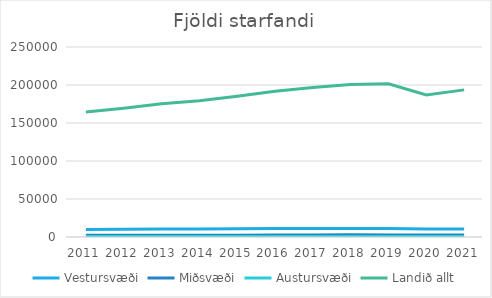
| Category | Vestursvæði | Miðsvæði | Austursvæði | Landið allt |
|---|---|---|---|---|
| 2011.0 | 9753.667 | 2243.667 | 595.667 | 164445.583 |
| 2012.0 | 10152.167 | 2228 | 608.417 | 169434.083 |
| 2013.0 | 10500.25 | 2268.333 | 621.167 | 175288.75 |
| 2014.0 | 10517.25 | 2283.583 | 605.333 | 179222.833 |
| 2015.0 | 10781.167 | 2363.417 | 614.25 | 185336.667 |
| 2016.0 | 11111.167 | 2482 | 604 | 191828.333 |
| 2017.0 | 11344.75 | 2711.25 | 604.583 | 196592 |
| 2018.0 | 11222 | 2884.333 | 613 | 200569.5 |
| 2019.0 | 11106 | 2573 | 598 | 201687.333 |
| 2020.0 | 10512 | 2766 | 619.75 | 186855.737 |
| 2021.0 | 10683.667 | 2660 | 641.417 | 193584 |